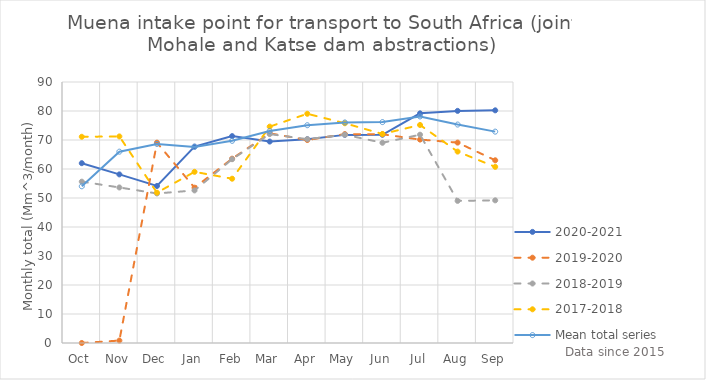
| Category | 2020-2021 | 2019-2020 | 2018-2019 | 2017-2018 | Mean total series |
|---|---|---|---|---|---|
| Oct | 62.004 | 0 | 55.63 | 71.111 | 54.035 |
| Nov | 58.14 | 0.838 | 53.633 | 71.231 | 65.977 |
| Dec | 54.145 | 69.089 | 51.559 | 51.834 | 68.649 |
| Jan | 67.749 | 53.564 | 52.615 | 59.024 | 67.601 |
| Feb | 71.339 | 63.559 | 63.38 | 56.649 | 69.711 |
| Mar | 69.465 | 72.312 | 72.042 | 74.611 | 73.091 |
| Apr | 70.272 | 69.991 | 70.293 | 79.047 | 75.093 |
| May | 71.766 | 72.039 | 71.83 | 75.773 | 76.047 |
| Jun | 71.807 | 71.983 | 69.043 | 72.072 | 76.177 |
| Jul | 79.191 | 70.145 | 71.826 | 75.182 | 78.121 |
| Aug | 80.042 | 69.104 | 49.015 | 66.004 | 75.33 |
| Sep | 80.233 | 63.006 | 49.192 | 60.736 | 72.887 |